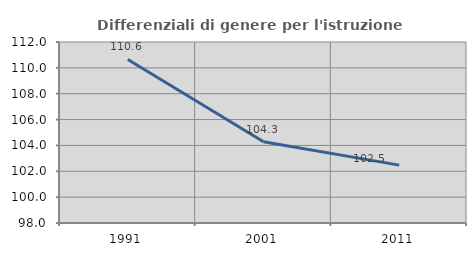
| Category | Differenziali di genere per l'istruzione superiore |
|---|---|
| 1991.0 | 110.649 |
| 2001.0 | 104.281 |
| 2011.0 | 102.476 |